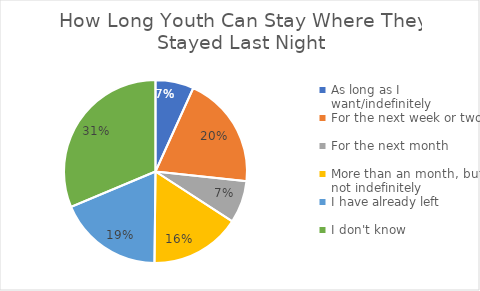
| Category | Series 0 |
|---|---|
| As long as I want/indefinitely | 19 |
| For the next week or two | 56 |
| For the next month | 21 |
| More than an month, but not indefinitely | 45 |
| I have already left | 52 |
| I don't know | 88 |